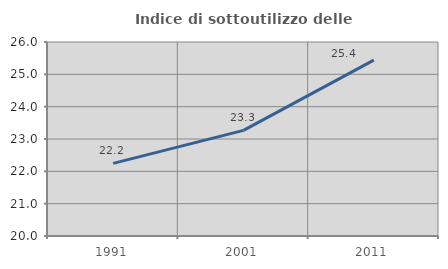
| Category | Indice di sottoutilizzo delle abitazioni  |
|---|---|
| 1991.0 | 22.246 |
| 2001.0 | 23.267 |
| 2011.0 | 25.441 |